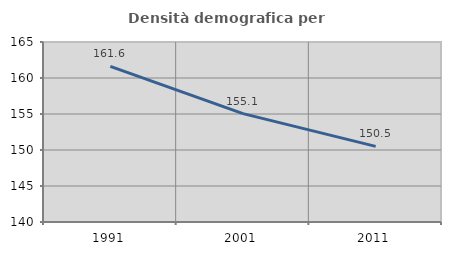
| Category | Densità demografica |
|---|---|
| 1991.0 | 161.616 |
| 2001.0 | 155.051 |
| 2011.0 | 150.505 |